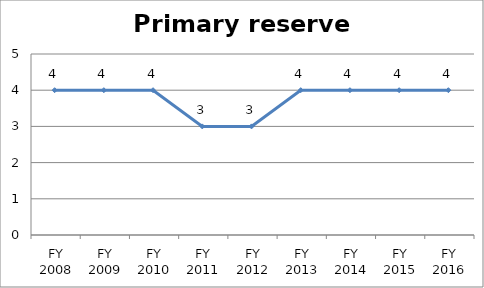
| Category | Primary reserve score |
|---|---|
| FY 2016 | 4 |
| FY 2015 | 4 |
| FY 2014 | 4 |
| FY 2013 | 4 |
| FY 2012 | 3 |
| FY 2011 | 3 |
| FY 2010 | 4 |
| FY 2009 | 4 |
| FY 2008 | 4 |